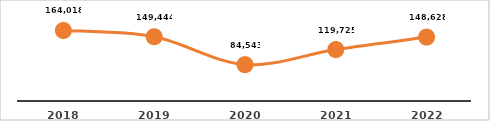
| Category | PERSONAS CAPACITADAS |
|---|---|
| 2018.0 | 164018 |
| 2019.0 | 149444 |
| 2020.0 | 84543 |
| 2021.0 | 119725 |
| 2022.0 | 148628 |